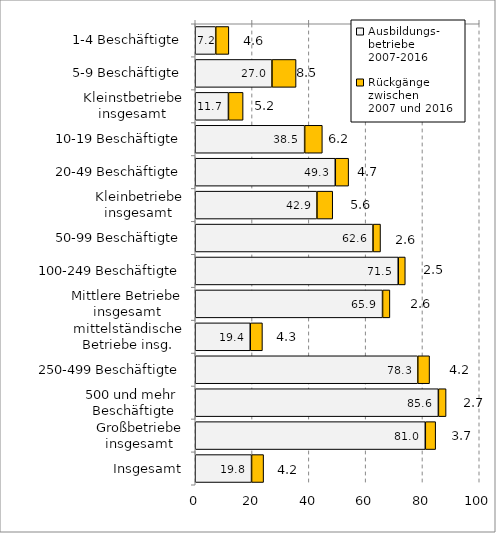
| Category | Ausbildungs- betriebe 
2007-2016 | Rückgänge zwischen 
2007 und 2016 |
|---|---|---|
| 1-4 Beschäftigte | 7.209 | 4.624 |
| 5-9 Beschäftigte | 27.011 | 8.489 |
| Kleinstbetriebe insgesamt | 11.689 | 5.159 |
| 10-19 Beschäftigte | 38.519 | 6.229 |
| 20-49 Beschäftigte | 49.309 | 4.699 |
| Kleinbetriebe insgesamt | 42.851 | 5.556 |
| 50-99 Beschäftigte | 62.592 | 2.643 |
| 100-249 Beschäftigte | 71.477 | 2.479 |
| Mittlere Betriebe insgesamt | 65.948 | 2.592 |
| mittelständische Betriebe insg. | 19.364 | 4.292 |
| 250-499 Beschäftigte | 78.35 | 4.158 |
| 500 und mehr  Beschäftigte | 85.609 | 2.714 |
| Großbetriebe insgesamt | 81.003 | 3.652 |
| Insgesamt | 19.822 | 4.245 |